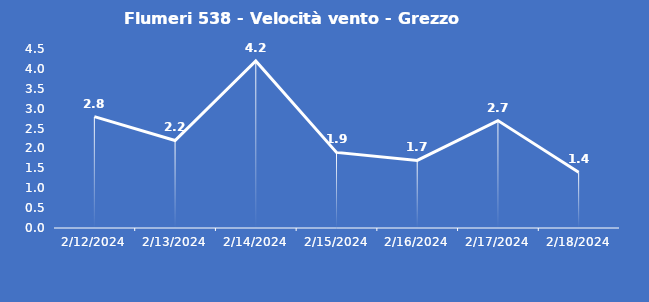
| Category | Flumeri 538 - Velocità vento - Grezzo (m/s) |
|---|---|
| 2/12/24 | 2.8 |
| 2/13/24 | 2.2 |
| 2/14/24 | 4.2 |
| 2/15/24 | 1.9 |
| 2/16/24 | 1.7 |
| 2/17/24 | 2.7 |
| 2/18/24 | 1.4 |